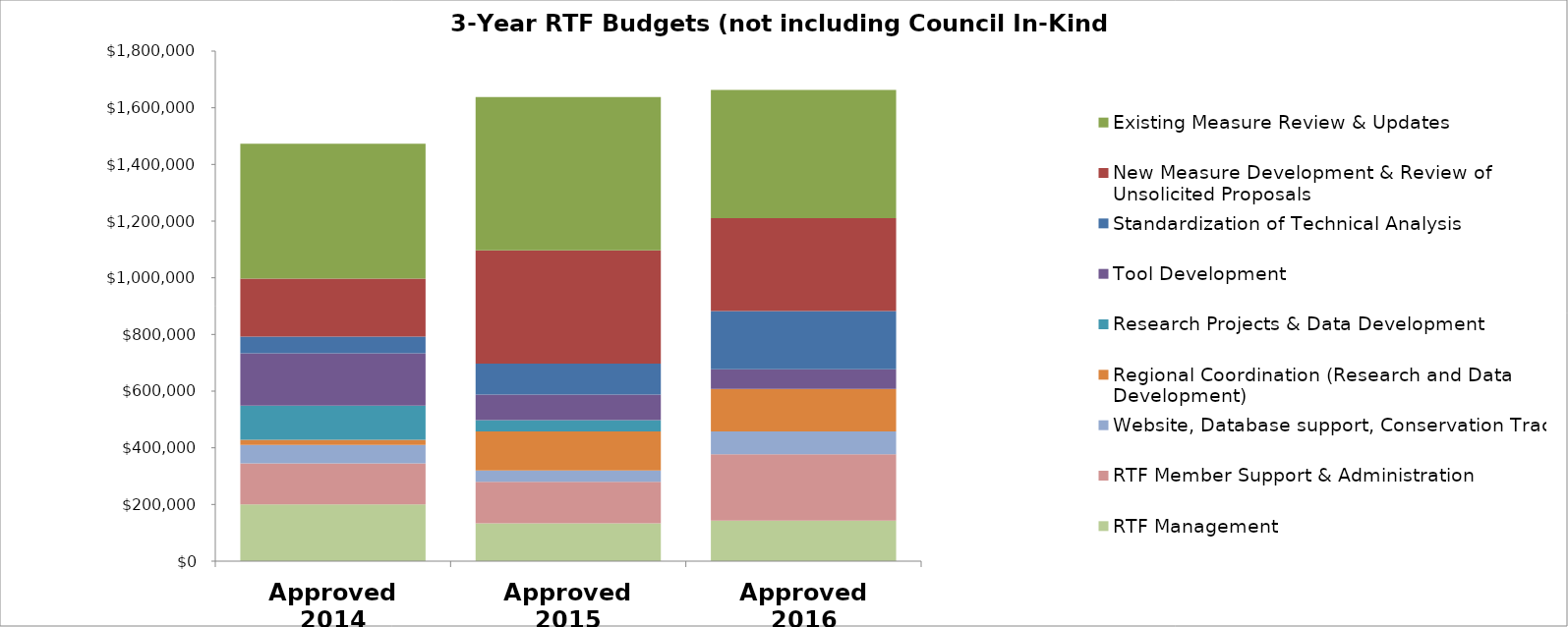
| Category | RTF Management | RTF Member Support & Administration | Website, Database support, Conservation Tracking  | Regional Coordination (Research and Data Development) | Research Projects & Data Development | Tool Development | Standardization of Technical Analysis | New Measure Development & Review of Unsolicited Proposals | Existing Measure Review & Updates |
|---|---|---|---|---|---|---|---|---|---|
| Approved 2014 | 200000 | 145000 | 65000 | 18500 | 120000 | 185000 | 59000 | 205000 | 475500 |
| Approved 2015 | 133300 | 146800 | 40000 | 137500 | 40000 | 90500 | 109000 | 400000 | 540500 |
| Approved 2016 | 143300 | 234200 | 80000 | 150000 | 0 | 70000 | 205000 | 328000 | 452500 |